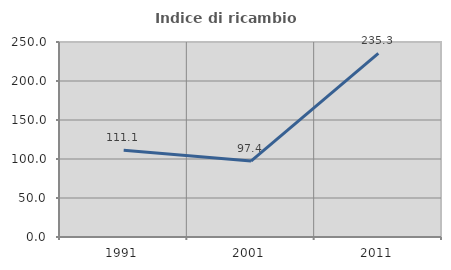
| Category | Indice di ricambio occupazionale  |
|---|---|
| 1991.0 | 111.111 |
| 2001.0 | 97.368 |
| 2011.0 | 235.294 |